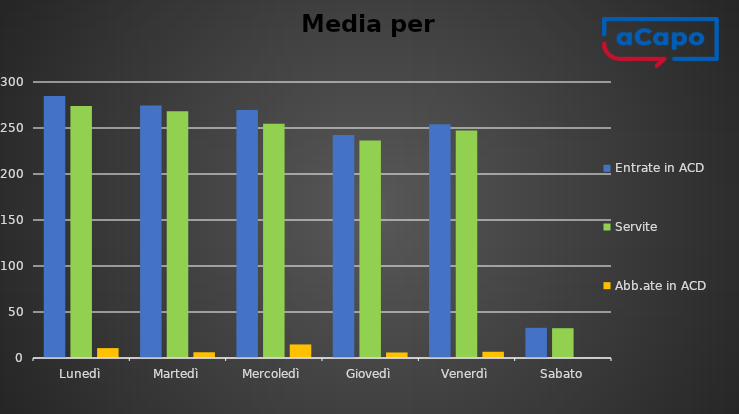
| Category | Entrate in ACD | Servite | Abb.ate in ACD |
|---|---|---|---|
| Lunedì | 284.75 | 274 | 10.75 |
| Martedì | 274.5 | 268.25 | 6.25 |
| Mercoledì | 269.5 | 254.75 | 14.75 |
| Giovedì | 242.5 | 236.5 | 6 |
| Venerdì | 254 | 247.2 | 6.8 |
| Sabato | 32.8 | 32.4 | 0.4 |